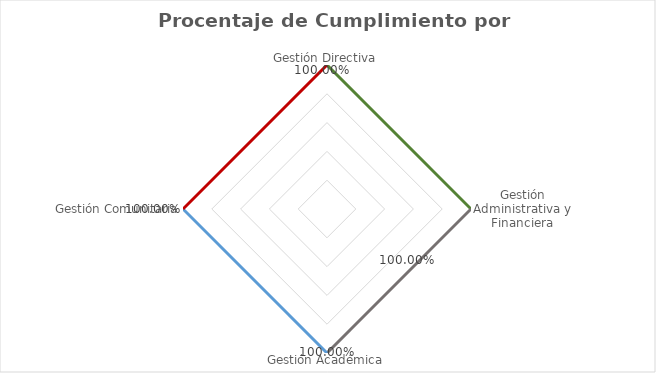
| Category | Series 0 |
|---|---|
| Gestión Directiva | 1 |
| Gestión Administrativa y Financiera | 1 |
| Gestión Académica | 1 |
| Gestión Comunitaria | 1 |